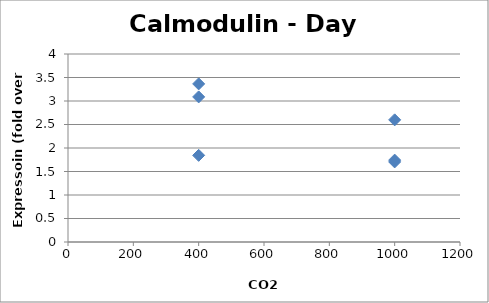
| Category | Series 0 |
|---|---|
| 1000.0 | 1.704 |
| 1000.0 | 1.742 |
| 1000.0 | 2.599 |
| 400.0 | 3.087 |
| 400.0 | 3.364 |
| 400.0 | 1.844 |